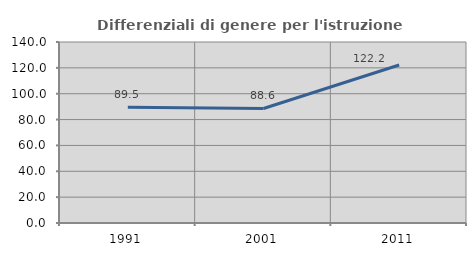
| Category | Differenziali di genere per l'istruzione superiore |
|---|---|
| 1991.0 | 89.516 |
| 2001.0 | 88.597 |
| 2011.0 | 122.182 |